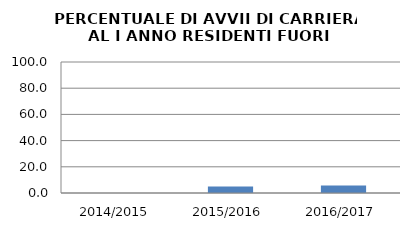
| Category | 2014/2015 2015/2016 2016/2017 |
|---|---|
| 2014/2015 | 0 |
| 2015/2016 | 5 |
| 2016/2017 | 5.769 |